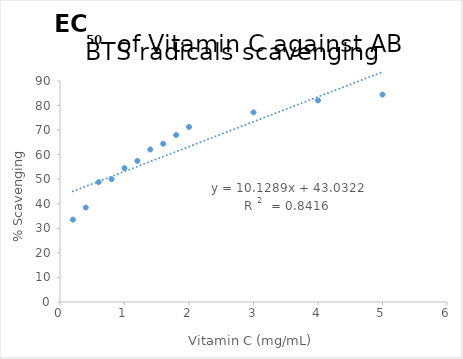
| Category | Series 0 |
|---|---|
| 0.2 | 33.55 |
| 0.4 | 38.46 |
| 0.6 | 48.803 |
| 0.8 | 50 |
| 1.0 | 54.49 |
| 1.2 | 57.48 |
| 1.4 | 62.1 |
| 1.6 | 64.45 |
| 1.8 | 68.007 |
| 2.0 | 71.283 |
| 3.0 | 77.22 |
| 4.0 | 82.07 |
| 5.0 | 84.47 |